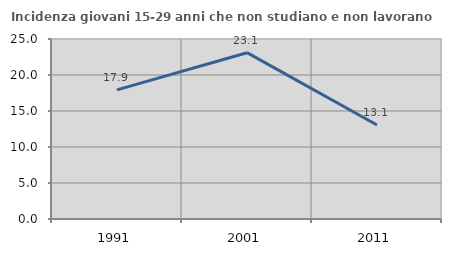
| Category | Incidenza giovani 15-29 anni che non studiano e non lavorano  |
|---|---|
| 1991.0 | 17.939 |
| 2001.0 | 23.099 |
| 2011.0 | 13.056 |